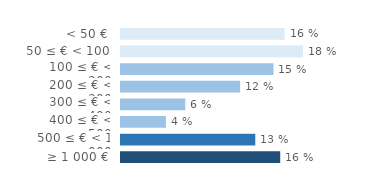
| Category | Series 0 |
|---|---|
| < 50 € | 0.16 |
| 50 ≤ € < 100 | 0.178 |
| 100 ≤ € < 200 | 0.15 |
| 200 ≤ € < 300 | 0.117 |
| 300 ≤ € < 400 | 0.063 |
| 400 ≤ € < 500 | 0.044 |
| 500 ≤ € < 1 000 | 0.132 |
| ≥ 1 000 € | 0.156 |